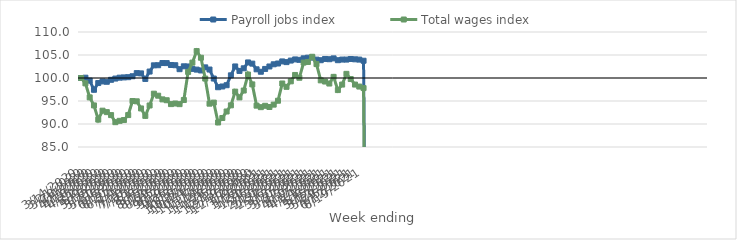
| Category | Payroll jobs index | Total wages index |
|---|---|---|
| 14/03/2020 | 100 | 100 |
| 21/03/2020 | 100.066 | 98.838 |
| 28/03/2020 | 99.437 | 95.788 |
| 04/04/2020 | 97.438 | 94.038 |
| 11/04/2020 | 98.9 | 90.953 |
| 18/04/2020 | 99.252 | 92.896 |
| 25/04/2020 | 99.178 | 92.581 |
| 02/05/2020 | 99.609 | 91.935 |
| 09/05/2020 | 99.877 | 90.396 |
| 16/05/2020 | 100.073 | 90.688 |
| 23/05/2020 | 100.126 | 90.859 |
| 30/05/2020 | 100.178 | 91.941 |
| 06/06/2020 | 100.379 | 94.993 |
| 13/06/2020 | 101.063 | 94.929 |
| 20/06/2020 | 101.005 | 93.382 |
| 27/06/2020 | 99.799 | 91.765 |
| 04/07/2020 | 101.401 | 94.026 |
| 11/07/2020 | 102.752 | 96.592 |
| 18/07/2020 | 102.777 | 96.154 |
| 25/07/2020 | 103.252 | 95.352 |
| 01/08/2020 | 103.24 | 95.165 |
| 08/08/2020 | 102.827 | 94.326 |
| 15/08/2020 | 102.778 | 94.454 |
| 22/08/2020 | 101.918 | 94.317 |
| 29/08/2020 | 102.541 | 95.213 |
| 05/09/2020 | 102.509 | 101.319 |
| 12/09/2020 | 101.976 | 103.343 |
| 19/09/2020 | 101.822 | 105.852 |
| 26/09/2020 | 101.64 | 104.402 |
| 03/10/2020 | 102.311 | 99.872 |
| 10/10/2020 | 101.84 | 94.422 |
| 17/10/2020 | 99.882 | 94.652 |
| 24/10/2020 | 97.995 | 90.328 |
| 31/10/2020 | 98.159 | 91.302 |
| 07/11/2020 | 98.432 | 92.719 |
| 14/11/2020 | 100.578 | 94.056 |
| 21/11/2020 | 102.513 | 97.037 |
| 28/11/2020 | 101.537 | 95.783 |
| 05/12/2020 | 102.11 | 97.276 |
| 12/12/2020 | 103.383 | 100.753 |
| 19/12/2020 | 103.124 | 98.611 |
| 26/12/2020 | 101.888 | 93.99 |
| 02/01/2021 | 101.359 | 93.66 |
| 09/01/2021 | 101.971 | 93.957 |
| 16/01/2021 | 102.504 | 93.694 |
| 23/01/2021 | 102.981 | 94.21 |
| 30/01/2021 | 103.15 | 95.059 |
| 06/02/2021 | 103.602 | 98.808 |
| 13/02/2021 | 103.454 | 98.079 |
| 20/02/2021 | 103.788 | 99.273 |
| 27/02/2021 | 104.036 | 100.662 |
| 06/03/2021 | 103.949 | 100.056 |
| 13/03/2021 | 104.278 | 103.349 |
| 20/03/2021 | 104.416 | 103.486 |
| 27/03/2021 | 104.432 | 104.615 |
| 03/04/2021 | 103.992 | 103.026 |
| 10/04/2021 | 103.868 | 99.485 |
| 17/04/2021 | 104.141 | 99.232 |
| 24/04/2021 | 104.085 | 98.798 |
| 01/05/2021 | 104.265 | 100.244 |
| 08/05/2021 | 103.87 | 97.374 |
| 15/05/2021 | 104.007 | 98.57 |
| 22/05/2021 | 104.005 | 100.901 |
| 29/05/2021 | 104.133 | 99.773 |
| 05/06/2021 | 104.062 | 98.572 |
| 12/06/2021 | 104 | 98.141 |
| 19/06/2021 | 103.753 | 97.81 |